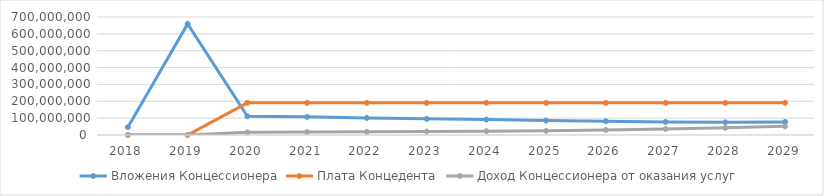
| Category | Вложения Концессионера | Плата Концедента | Доход Концессионера от оказания услуг |
|---|---|---|---|
| 2018.0 | 46405134.953 | 0 | 0 |
| 2019.0 | 659162443.366 | 0 | 0 |
| 2020.0 | 111189325.332 | 190833493.368 | 15660000 |
| 2021.0 | 107651235.406 | 190833493.368 | 17097600 |
| 2022.0 | 100897288.838 | 190833493.368 | 18668416 |
| 2023.0 | 95709033.401 | 190833493.368 | 20388160 |
| 2024.0 | 91372867.819 | 190833493.368 | 22630913.843 |
| 2025.0 | 85594757.313 | 190833493.368 | 25008300.409 |
| 2026.0 | 81814605.119 | 190833493.368 | 29909927.289 |
| 2027.0 | 77334045.382 | 190833493.368 | 35772273.038 |
| 2028.0 | 74901130.913 | 190833493.368 | 42783638.553 |
| 2029.0 | 77419515.326 | 190833493.368 | 51169231.709 |